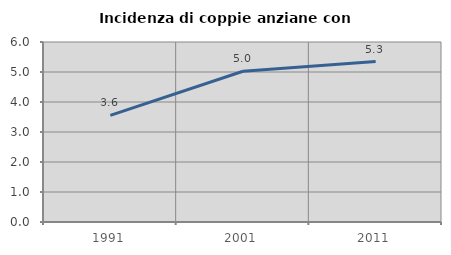
| Category | Incidenza di coppie anziane con figli |
|---|---|
| 1991.0 | 3.553 |
| 2001.0 | 5.025 |
| 2011.0 | 5.349 |